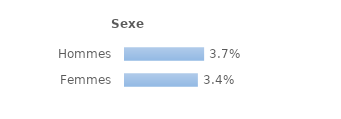
| Category | Series 0 |
|---|---|
| Hommes | 0.037 |
| Femmes | 0.034 |